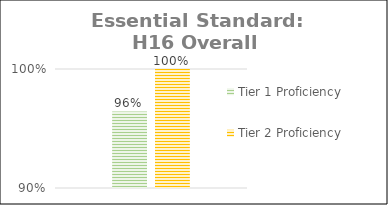
| Category | Tier 1 Proficiency | Tier 2 Proficiency |
|---|---|---|
| 0 | 0.964 | 1 |